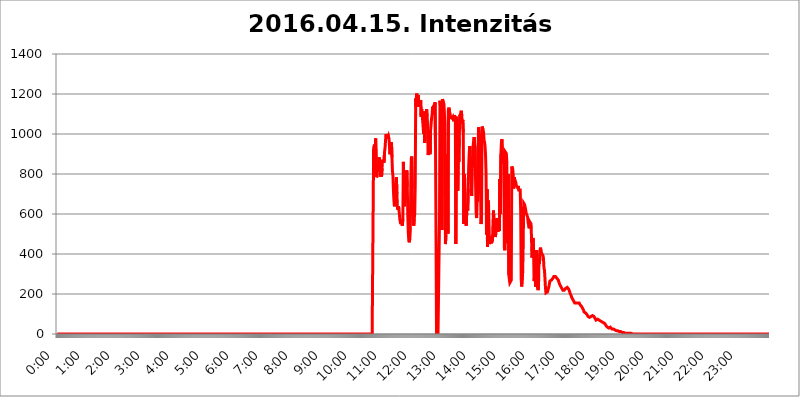
| Category | 2016.04.15. Intenzitás [W/m^2] |
|---|---|
| 0.0 | 0 |
| 0.0006944444444444445 | 0 |
| 0.001388888888888889 | 0 |
| 0.0020833333333333333 | 0 |
| 0.002777777777777778 | 0 |
| 0.003472222222222222 | 0 |
| 0.004166666666666667 | 0 |
| 0.004861111111111111 | 0 |
| 0.005555555555555556 | 0 |
| 0.0062499999999999995 | 0 |
| 0.006944444444444444 | 0 |
| 0.007638888888888889 | 0 |
| 0.008333333333333333 | 0 |
| 0.009027777777777779 | 0 |
| 0.009722222222222222 | 0 |
| 0.010416666666666666 | 0 |
| 0.011111111111111112 | 0 |
| 0.011805555555555555 | 0 |
| 0.012499999999999999 | 0 |
| 0.013194444444444444 | 0 |
| 0.013888888888888888 | 0 |
| 0.014583333333333332 | 0 |
| 0.015277777777777777 | 0 |
| 0.015972222222222224 | 0 |
| 0.016666666666666666 | 0 |
| 0.017361111111111112 | 0 |
| 0.018055555555555557 | 0 |
| 0.01875 | 0 |
| 0.019444444444444445 | 0 |
| 0.02013888888888889 | 0 |
| 0.020833333333333332 | 0 |
| 0.02152777777777778 | 0 |
| 0.022222222222222223 | 0 |
| 0.02291666666666667 | 0 |
| 0.02361111111111111 | 0 |
| 0.024305555555555556 | 0 |
| 0.024999999999999998 | 0 |
| 0.025694444444444447 | 0 |
| 0.02638888888888889 | 0 |
| 0.027083333333333334 | 0 |
| 0.027777777777777776 | 0 |
| 0.02847222222222222 | 0 |
| 0.029166666666666664 | 0 |
| 0.029861111111111113 | 0 |
| 0.030555555555555555 | 0 |
| 0.03125 | 0 |
| 0.03194444444444445 | 0 |
| 0.03263888888888889 | 0 |
| 0.03333333333333333 | 0 |
| 0.034027777777777775 | 0 |
| 0.034722222222222224 | 0 |
| 0.035416666666666666 | 0 |
| 0.036111111111111115 | 0 |
| 0.03680555555555556 | 0 |
| 0.0375 | 0 |
| 0.03819444444444444 | 0 |
| 0.03888888888888889 | 0 |
| 0.03958333333333333 | 0 |
| 0.04027777777777778 | 0 |
| 0.04097222222222222 | 0 |
| 0.041666666666666664 | 0 |
| 0.042361111111111106 | 0 |
| 0.04305555555555556 | 0 |
| 0.043750000000000004 | 0 |
| 0.044444444444444446 | 0 |
| 0.04513888888888889 | 0 |
| 0.04583333333333334 | 0 |
| 0.04652777777777778 | 0 |
| 0.04722222222222222 | 0 |
| 0.04791666666666666 | 0 |
| 0.04861111111111111 | 0 |
| 0.049305555555555554 | 0 |
| 0.049999999999999996 | 0 |
| 0.05069444444444445 | 0 |
| 0.051388888888888894 | 0 |
| 0.052083333333333336 | 0 |
| 0.05277777777777778 | 0 |
| 0.05347222222222222 | 0 |
| 0.05416666666666667 | 0 |
| 0.05486111111111111 | 0 |
| 0.05555555555555555 | 0 |
| 0.05625 | 0 |
| 0.05694444444444444 | 0 |
| 0.057638888888888885 | 0 |
| 0.05833333333333333 | 0 |
| 0.05902777777777778 | 0 |
| 0.059722222222222225 | 0 |
| 0.06041666666666667 | 0 |
| 0.061111111111111116 | 0 |
| 0.06180555555555556 | 0 |
| 0.0625 | 0 |
| 0.06319444444444444 | 0 |
| 0.06388888888888888 | 0 |
| 0.06458333333333334 | 0 |
| 0.06527777777777778 | 0 |
| 0.06597222222222222 | 0 |
| 0.06666666666666667 | 0 |
| 0.06736111111111111 | 0 |
| 0.06805555555555555 | 0 |
| 0.06874999999999999 | 0 |
| 0.06944444444444443 | 0 |
| 0.07013888888888889 | 0 |
| 0.07083333333333333 | 0 |
| 0.07152777777777779 | 0 |
| 0.07222222222222223 | 0 |
| 0.07291666666666667 | 0 |
| 0.07361111111111111 | 0 |
| 0.07430555555555556 | 0 |
| 0.075 | 0 |
| 0.07569444444444444 | 0 |
| 0.0763888888888889 | 0 |
| 0.07708333333333334 | 0 |
| 0.07777777777777778 | 0 |
| 0.07847222222222222 | 0 |
| 0.07916666666666666 | 0 |
| 0.0798611111111111 | 0 |
| 0.08055555555555556 | 0 |
| 0.08125 | 0 |
| 0.08194444444444444 | 0 |
| 0.08263888888888889 | 0 |
| 0.08333333333333333 | 0 |
| 0.08402777777777777 | 0 |
| 0.08472222222222221 | 0 |
| 0.08541666666666665 | 0 |
| 0.08611111111111112 | 0 |
| 0.08680555555555557 | 0 |
| 0.08750000000000001 | 0 |
| 0.08819444444444445 | 0 |
| 0.08888888888888889 | 0 |
| 0.08958333333333333 | 0 |
| 0.09027777777777778 | 0 |
| 0.09097222222222222 | 0 |
| 0.09166666666666667 | 0 |
| 0.09236111111111112 | 0 |
| 0.09305555555555556 | 0 |
| 0.09375 | 0 |
| 0.09444444444444444 | 0 |
| 0.09513888888888888 | 0 |
| 0.09583333333333333 | 0 |
| 0.09652777777777777 | 0 |
| 0.09722222222222222 | 0 |
| 0.09791666666666667 | 0 |
| 0.09861111111111111 | 0 |
| 0.09930555555555555 | 0 |
| 0.09999999999999999 | 0 |
| 0.10069444444444443 | 0 |
| 0.1013888888888889 | 0 |
| 0.10208333333333335 | 0 |
| 0.10277777777777779 | 0 |
| 0.10347222222222223 | 0 |
| 0.10416666666666667 | 0 |
| 0.10486111111111111 | 0 |
| 0.10555555555555556 | 0 |
| 0.10625 | 0 |
| 0.10694444444444444 | 0 |
| 0.1076388888888889 | 0 |
| 0.10833333333333334 | 0 |
| 0.10902777777777778 | 0 |
| 0.10972222222222222 | 0 |
| 0.1111111111111111 | 0 |
| 0.11180555555555556 | 0 |
| 0.11180555555555556 | 0 |
| 0.1125 | 0 |
| 0.11319444444444444 | 0 |
| 0.11388888888888889 | 0 |
| 0.11458333333333333 | 0 |
| 0.11527777777777777 | 0 |
| 0.11597222222222221 | 0 |
| 0.11666666666666665 | 0 |
| 0.1173611111111111 | 0 |
| 0.11805555555555557 | 0 |
| 0.11944444444444445 | 0 |
| 0.12013888888888889 | 0 |
| 0.12083333333333333 | 0 |
| 0.12152777777777778 | 0 |
| 0.12222222222222223 | 0 |
| 0.12291666666666667 | 0 |
| 0.12291666666666667 | 0 |
| 0.12361111111111112 | 0 |
| 0.12430555555555556 | 0 |
| 0.125 | 0 |
| 0.12569444444444444 | 0 |
| 0.12638888888888888 | 0 |
| 0.12708333333333333 | 0 |
| 0.16875 | 0 |
| 0.12847222222222224 | 0 |
| 0.12916666666666668 | 0 |
| 0.12986111111111112 | 0 |
| 0.13055555555555556 | 0 |
| 0.13125 | 0 |
| 0.13194444444444445 | 0 |
| 0.1326388888888889 | 0 |
| 0.13333333333333333 | 0 |
| 0.13402777777777777 | 0 |
| 0.13402777777777777 | 0 |
| 0.13472222222222222 | 0 |
| 0.13541666666666666 | 0 |
| 0.1361111111111111 | 0 |
| 0.13749999999999998 | 0 |
| 0.13819444444444443 | 0 |
| 0.1388888888888889 | 0 |
| 0.13958333333333334 | 0 |
| 0.14027777777777778 | 0 |
| 0.14097222222222222 | 0 |
| 0.14166666666666666 | 0 |
| 0.1423611111111111 | 0 |
| 0.14305555555555557 | 0 |
| 0.14375000000000002 | 0 |
| 0.14444444444444446 | 0 |
| 0.1451388888888889 | 0 |
| 0.1451388888888889 | 0 |
| 0.14652777777777778 | 0 |
| 0.14722222222222223 | 0 |
| 0.14791666666666667 | 0 |
| 0.1486111111111111 | 0 |
| 0.14930555555555555 | 0 |
| 0.15 | 0 |
| 0.15069444444444444 | 0 |
| 0.15138888888888888 | 0 |
| 0.15208333333333332 | 0 |
| 0.15277777777777776 | 0 |
| 0.15347222222222223 | 0 |
| 0.15416666666666667 | 0 |
| 0.15486111111111112 | 0 |
| 0.15555555555555556 | 0 |
| 0.15625 | 0 |
| 0.15694444444444444 | 0 |
| 0.15763888888888888 | 0 |
| 0.15833333333333333 | 0 |
| 0.15902777777777777 | 0 |
| 0.15972222222222224 | 0 |
| 0.16041666666666668 | 0 |
| 0.16111111111111112 | 0 |
| 0.16180555555555556 | 0 |
| 0.1625 | 0 |
| 0.16319444444444445 | 0 |
| 0.1638888888888889 | 0 |
| 0.16458333333333333 | 0 |
| 0.16527777777777777 | 0 |
| 0.16597222222222222 | 0 |
| 0.16666666666666666 | 0 |
| 0.1673611111111111 | 0 |
| 0.16805555555555554 | 0 |
| 0.16874999999999998 | 0 |
| 0.16944444444444443 | 0 |
| 0.17013888888888887 | 0 |
| 0.1708333333333333 | 0 |
| 0.17152777777777775 | 0 |
| 0.17222222222222225 | 0 |
| 0.1729166666666667 | 0 |
| 0.17361111111111113 | 0 |
| 0.17430555555555557 | 0 |
| 0.17500000000000002 | 0 |
| 0.17569444444444446 | 0 |
| 0.1763888888888889 | 0 |
| 0.17708333333333334 | 0 |
| 0.17777777777777778 | 0 |
| 0.17847222222222223 | 0 |
| 0.17916666666666667 | 0 |
| 0.1798611111111111 | 0 |
| 0.18055555555555555 | 0 |
| 0.18125 | 0 |
| 0.18194444444444444 | 0 |
| 0.1826388888888889 | 0 |
| 0.18333333333333335 | 0 |
| 0.1840277777777778 | 0 |
| 0.18472222222222223 | 0 |
| 0.18541666666666667 | 0 |
| 0.18611111111111112 | 0 |
| 0.18680555555555556 | 0 |
| 0.1875 | 0 |
| 0.18819444444444444 | 0 |
| 0.18888888888888888 | 0 |
| 0.18958333333333333 | 0 |
| 0.19027777777777777 | 0 |
| 0.1909722222222222 | 0 |
| 0.19166666666666665 | 0 |
| 0.19236111111111112 | 0 |
| 0.19305555555555554 | 0 |
| 0.19375 | 0 |
| 0.19444444444444445 | 0 |
| 0.1951388888888889 | 0 |
| 0.19583333333333333 | 0 |
| 0.19652777777777777 | 0 |
| 0.19722222222222222 | 0 |
| 0.19791666666666666 | 0 |
| 0.1986111111111111 | 0 |
| 0.19930555555555554 | 0 |
| 0.19999999999999998 | 0 |
| 0.20069444444444443 | 0 |
| 0.20138888888888887 | 0 |
| 0.2020833333333333 | 0 |
| 0.2027777777777778 | 0 |
| 0.2034722222222222 | 0 |
| 0.2041666666666667 | 0 |
| 0.20486111111111113 | 0 |
| 0.20555555555555557 | 0 |
| 0.20625000000000002 | 0 |
| 0.20694444444444446 | 0 |
| 0.2076388888888889 | 0 |
| 0.20833333333333334 | 0 |
| 0.20902777777777778 | 0 |
| 0.20972222222222223 | 0 |
| 0.21041666666666667 | 0 |
| 0.2111111111111111 | 0 |
| 0.21180555555555555 | 0 |
| 0.2125 | 0 |
| 0.21319444444444444 | 0 |
| 0.2138888888888889 | 0 |
| 0.21458333333333335 | 0 |
| 0.2152777777777778 | 0 |
| 0.21597222222222223 | 0 |
| 0.21666666666666667 | 0 |
| 0.21736111111111112 | 0 |
| 0.21805555555555556 | 0 |
| 0.21875 | 0 |
| 0.21944444444444444 | 0 |
| 0.22013888888888888 | 0 |
| 0.22083333333333333 | 0 |
| 0.22152777777777777 | 0 |
| 0.2222222222222222 | 0 |
| 0.22291666666666665 | 0 |
| 0.2236111111111111 | 0 |
| 0.22430555555555556 | 0 |
| 0.225 | 0 |
| 0.22569444444444445 | 0 |
| 0.2263888888888889 | 0 |
| 0.22708333333333333 | 0 |
| 0.22777777777777777 | 0 |
| 0.22847222222222222 | 0 |
| 0.22916666666666666 | 0 |
| 0.2298611111111111 | 0 |
| 0.23055555555555554 | 0 |
| 0.23124999999999998 | 0 |
| 0.23194444444444443 | 0 |
| 0.23263888888888887 | 0 |
| 0.2333333333333333 | 0 |
| 0.2340277777777778 | 0 |
| 0.2347222222222222 | 0 |
| 0.2354166666666667 | 0 |
| 0.23611111111111113 | 0 |
| 0.23680555555555557 | 0 |
| 0.23750000000000002 | 0 |
| 0.23819444444444446 | 0 |
| 0.2388888888888889 | 0 |
| 0.23958333333333334 | 0 |
| 0.24027777777777778 | 0 |
| 0.24097222222222223 | 0 |
| 0.24166666666666667 | 0 |
| 0.2423611111111111 | 0 |
| 0.24305555555555555 | 0 |
| 0.24375 | 0 |
| 0.24444444444444446 | 0 |
| 0.24513888888888888 | 0 |
| 0.24583333333333335 | 0 |
| 0.2465277777777778 | 0 |
| 0.24722222222222223 | 0 |
| 0.24791666666666667 | 0 |
| 0.24861111111111112 | 0 |
| 0.24930555555555556 | 0 |
| 0.25 | 0 |
| 0.25069444444444444 | 0 |
| 0.2513888888888889 | 0 |
| 0.2520833333333333 | 0 |
| 0.25277777777777777 | 0 |
| 0.2534722222222222 | 0 |
| 0.25416666666666665 | 0 |
| 0.2548611111111111 | 0 |
| 0.2555555555555556 | 0 |
| 0.25625000000000003 | 0 |
| 0.2569444444444445 | 0 |
| 0.2576388888888889 | 0 |
| 0.25833333333333336 | 0 |
| 0.2590277777777778 | 0 |
| 0.25972222222222224 | 0 |
| 0.2604166666666667 | 0 |
| 0.2611111111111111 | 0 |
| 0.26180555555555557 | 0 |
| 0.2625 | 0 |
| 0.26319444444444445 | 0 |
| 0.2638888888888889 | 0 |
| 0.26458333333333334 | 0 |
| 0.2652777777777778 | 0 |
| 0.2659722222222222 | 0 |
| 0.26666666666666666 | 0 |
| 0.2673611111111111 | 0 |
| 0.26805555555555555 | 0 |
| 0.26875 | 0 |
| 0.26944444444444443 | 0 |
| 0.2701388888888889 | 0 |
| 0.2708333333333333 | 0 |
| 0.27152777777777776 | 0 |
| 0.2722222222222222 | 0 |
| 0.27291666666666664 | 0 |
| 0.2736111111111111 | 0 |
| 0.2743055555555555 | 0 |
| 0.27499999999999997 | 0 |
| 0.27569444444444446 | 0 |
| 0.27638888888888885 | 0 |
| 0.27708333333333335 | 0 |
| 0.2777777777777778 | 0 |
| 0.27847222222222223 | 0 |
| 0.2791666666666667 | 0 |
| 0.2798611111111111 | 0 |
| 0.28055555555555556 | 0 |
| 0.28125 | 0 |
| 0.28194444444444444 | 0 |
| 0.2826388888888889 | 0 |
| 0.2833333333333333 | 0 |
| 0.28402777777777777 | 0 |
| 0.2847222222222222 | 0 |
| 0.28541666666666665 | 0 |
| 0.28611111111111115 | 0 |
| 0.28680555555555554 | 0 |
| 0.28750000000000003 | 0 |
| 0.2881944444444445 | 0 |
| 0.2888888888888889 | 0 |
| 0.28958333333333336 | 0 |
| 0.2902777777777778 | 0 |
| 0.29097222222222224 | 0 |
| 0.2916666666666667 | 0 |
| 0.2923611111111111 | 0 |
| 0.29305555555555557 | 0 |
| 0.29375 | 0 |
| 0.29444444444444445 | 0 |
| 0.2951388888888889 | 0 |
| 0.29583333333333334 | 0 |
| 0.2965277777777778 | 0 |
| 0.2972222222222222 | 0 |
| 0.29791666666666666 | 0 |
| 0.2986111111111111 | 0 |
| 0.29930555555555555 | 0 |
| 0.3 | 0 |
| 0.30069444444444443 | 0 |
| 0.3013888888888889 | 0 |
| 0.3020833333333333 | 0 |
| 0.30277777777777776 | 0 |
| 0.3034722222222222 | 0 |
| 0.30416666666666664 | 0 |
| 0.3048611111111111 | 0 |
| 0.3055555555555555 | 0 |
| 0.30624999999999997 | 0 |
| 0.3069444444444444 | 0 |
| 0.3076388888888889 | 0 |
| 0.30833333333333335 | 0 |
| 0.3090277777777778 | 0 |
| 0.30972222222222223 | 0 |
| 0.3104166666666667 | 0 |
| 0.3111111111111111 | 0 |
| 0.31180555555555556 | 0 |
| 0.3125 | 0 |
| 0.31319444444444444 | 0 |
| 0.3138888888888889 | 0 |
| 0.3145833333333333 | 0 |
| 0.31527777777777777 | 0 |
| 0.3159722222222222 | 0 |
| 0.31666666666666665 | 0 |
| 0.31736111111111115 | 0 |
| 0.31805555555555554 | 0 |
| 0.31875000000000003 | 0 |
| 0.3194444444444445 | 0 |
| 0.3201388888888889 | 0 |
| 0.32083333333333336 | 0 |
| 0.3215277777777778 | 0 |
| 0.32222222222222224 | 0 |
| 0.3229166666666667 | 0 |
| 0.3236111111111111 | 0 |
| 0.32430555555555557 | 0 |
| 0.325 | 0 |
| 0.32569444444444445 | 0 |
| 0.3263888888888889 | 0 |
| 0.32708333333333334 | 0 |
| 0.3277777777777778 | 0 |
| 0.3284722222222222 | 0 |
| 0.32916666666666666 | 0 |
| 0.3298611111111111 | 0 |
| 0.33055555555555555 | 0 |
| 0.33125 | 0 |
| 0.33194444444444443 | 0 |
| 0.3326388888888889 | 0 |
| 0.3333333333333333 | 0 |
| 0.3340277777777778 | 0 |
| 0.3347222222222222 | 0 |
| 0.3354166666666667 | 0 |
| 0.3361111111111111 | 0 |
| 0.3368055555555556 | 0 |
| 0.33749999999999997 | 0 |
| 0.33819444444444446 | 0 |
| 0.33888888888888885 | 0 |
| 0.33958333333333335 | 0 |
| 0.34027777777777773 | 0 |
| 0.34097222222222223 | 0 |
| 0.3416666666666666 | 0 |
| 0.3423611111111111 | 0 |
| 0.3430555555555555 | 0 |
| 0.34375 | 0 |
| 0.3444444444444445 | 0 |
| 0.3451388888888889 | 0 |
| 0.3458333333333334 | 0 |
| 0.34652777777777777 | 0 |
| 0.34722222222222227 | 0 |
| 0.34791666666666665 | 0 |
| 0.34861111111111115 | 0 |
| 0.34930555555555554 | 0 |
| 0.35000000000000003 | 0 |
| 0.3506944444444444 | 0 |
| 0.3513888888888889 | 0 |
| 0.3520833333333333 | 0 |
| 0.3527777777777778 | 0 |
| 0.3534722222222222 | 0 |
| 0.3541666666666667 | 0 |
| 0.3548611111111111 | 0 |
| 0.35555555555555557 | 0 |
| 0.35625 | 0 |
| 0.35694444444444445 | 0 |
| 0.3576388888888889 | 0 |
| 0.35833333333333334 | 0 |
| 0.3590277777777778 | 0 |
| 0.3597222222222222 | 0 |
| 0.36041666666666666 | 0 |
| 0.3611111111111111 | 0 |
| 0.36180555555555555 | 0 |
| 0.3625 | 0 |
| 0.36319444444444443 | 0 |
| 0.3638888888888889 | 0 |
| 0.3645833333333333 | 0 |
| 0.3652777777777778 | 0 |
| 0.3659722222222222 | 0 |
| 0.3666666666666667 | 0 |
| 0.3673611111111111 | 0 |
| 0.3680555555555556 | 0 |
| 0.36874999999999997 | 0 |
| 0.36944444444444446 | 0 |
| 0.37013888888888885 | 0 |
| 0.37083333333333335 | 0 |
| 0.37152777777777773 | 0 |
| 0.37222222222222223 | 0 |
| 0.3729166666666666 | 0 |
| 0.3736111111111111 | 0 |
| 0.3743055555555555 | 0 |
| 0.375 | 0 |
| 0.3756944444444445 | 0 |
| 0.3763888888888889 | 0 |
| 0.3770833333333334 | 0 |
| 0.37777777777777777 | 0 |
| 0.37847222222222227 | 0 |
| 0.37916666666666665 | 0 |
| 0.37986111111111115 | 0 |
| 0.38055555555555554 | 0 |
| 0.38125000000000003 | 0 |
| 0.3819444444444444 | 0 |
| 0.3826388888888889 | 0 |
| 0.3833333333333333 | 0 |
| 0.3840277777777778 | 0 |
| 0.3847222222222222 | 0 |
| 0.3854166666666667 | 0 |
| 0.3861111111111111 | 0 |
| 0.38680555555555557 | 0 |
| 0.3875 | 0 |
| 0.38819444444444445 | 0 |
| 0.3888888888888889 | 0 |
| 0.38958333333333334 | 0 |
| 0.3902777777777778 | 0 |
| 0.3909722222222222 | 0 |
| 0.39166666666666666 | 0 |
| 0.3923611111111111 | 0 |
| 0.39305555555555555 | 0 |
| 0.39375 | 0 |
| 0.39444444444444443 | 0 |
| 0.3951388888888889 | 0 |
| 0.3958333333333333 | 0 |
| 0.3965277777777778 | 0 |
| 0.3972222222222222 | 0 |
| 0.3979166666666667 | 0 |
| 0.3986111111111111 | 0 |
| 0.3993055555555556 | 0 |
| 0.39999999999999997 | 0 |
| 0.40069444444444446 | 0 |
| 0.40138888888888885 | 0 |
| 0.40208333333333335 | 0 |
| 0.40277777777777773 | 0 |
| 0.40347222222222223 | 0 |
| 0.4041666666666666 | 0 |
| 0.4048611111111111 | 0 |
| 0.4055555555555555 | 0 |
| 0.40625 | 0 |
| 0.4069444444444445 | 0 |
| 0.4076388888888889 | 0 |
| 0.4083333333333334 | 0 |
| 0.40902777777777777 | 0 |
| 0.40972222222222227 | 0 |
| 0.41041666666666665 | 0 |
| 0.41111111111111115 | 0 |
| 0.41180555555555554 | 0 |
| 0.41250000000000003 | 0 |
| 0.4131944444444444 | 0 |
| 0.4138888888888889 | 0 |
| 0.4145833333333333 | 0 |
| 0.4152777777777778 | 0 |
| 0.4159722222222222 | 0 |
| 0.4166666666666667 | 0 |
| 0.4173611111111111 | 0 |
| 0.41805555555555557 | 0 |
| 0.41875 | 0 |
| 0.41944444444444445 | 0 |
| 0.4201388888888889 | 0 |
| 0.42083333333333334 | 0 |
| 0.4215277777777778 | 0 |
| 0.4222222222222222 | 0 |
| 0.42291666666666666 | 0 |
| 0.4236111111111111 | 0 |
| 0.42430555555555555 | 0 |
| 0.425 | 0 |
| 0.42569444444444443 | 0 |
| 0.4263888888888889 | 0 |
| 0.4270833333333333 | 0 |
| 0.4277777777777778 | 0 |
| 0.4284722222222222 | 0 |
| 0.4291666666666667 | 0 |
| 0.4298611111111111 | 0 |
| 0.4305555555555556 | 0 |
| 0.43124999999999997 | 0 |
| 0.43194444444444446 | 0 |
| 0.43263888888888885 | 0 |
| 0.43333333333333335 | 0 |
| 0.43402777777777773 | 0 |
| 0.43472222222222223 | 0 |
| 0.4354166666666666 | 0 |
| 0.4361111111111111 | 0 |
| 0.4368055555555555 | 0 |
| 0.4375 | 0 |
| 0.4381944444444445 | 0 |
| 0.4388888888888889 | 0 |
| 0.4395833333333334 | 0 |
| 0.44027777777777777 | 0 |
| 0.44097222222222227 | 0 |
| 0.44166666666666665 | 0 |
| 0.44236111111111115 | 0 |
| 0.44305555555555554 | 0 |
| 0.44375000000000003 | 932.576 |
| 0.4444444444444444 | 932.576 |
| 0.4451388888888889 | 947.58 |
| 0.4458333333333333 | 909.996 |
| 0.4465277777777778 | 977.508 |
| 0.4472222222222222 | 879.719 |
| 0.4479166666666667 | 783.342 |
| 0.4486111111111111 | 791.169 |
| 0.44930555555555557 | 826.123 |
| 0.45 | 841.526 |
| 0.45069444444444445 | 829.981 |
| 0.4513888888888889 | 883.516 |
| 0.45208333333333334 | 841.526 |
| 0.4527777777777778 | 856.855 |
| 0.4534722222222222 | 787.258 |
| 0.45416666666666666 | 806.757 |
| 0.4548611111111111 | 787.258 |
| 0.45555555555555555 | 829.981 |
| 0.45625 | 872.114 |
| 0.45694444444444443 | 875.918 |
| 0.4576388888888889 | 868.305 |
| 0.4583333333333333 | 856.855 |
| 0.4590277777777778 | 909.996 |
| 0.4597222222222222 | 928.819 |
| 0.4604166666666667 | 966.295 |
| 0.4611111111111111 | 999.916 |
| 0.4618055555555556 | 996.182 |
| 0.46249999999999997 | 977.508 |
| 0.46319444444444446 | 999.916 |
| 0.46388888888888885 | 981.244 |
| 0.46458333333333335 | 988.714 |
| 0.46527777777777773 | 977.508 |
| 0.46597222222222223 | 981.244 |
| 0.4666666666666666 | 898.668 |
| 0.4673611111111111 | 936.33 |
| 0.4680555555555555 | 951.327 |
| 0.46875 | 958.814 |
| 0.4694444444444445 | 883.516 |
| 0.4701388888888889 | 814.519 |
| 0.4708333333333334 | 791.169 |
| 0.47152777777777777 | 715.858 |
| 0.47222222222222227 | 667.123 |
| 0.47291666666666665 | 638.256 |
| 0.47361111111111115 | 675.311 |
| 0.47430555555555554 | 743.859 |
| 0.47500000000000003 | 759.723 |
| 0.4756944444444444 | 783.342 |
| 0.4763888888888889 | 703.762 |
| 0.4770833333333333 | 634.105 |
| 0.4777777777777778 | 621.613 |
| 0.4784722222222222 | 638.256 |
| 0.4791666666666667 | 625.784 |
| 0.4798611111111111 | 621.613 |
| 0.48055555555555557 | 571.049 |
| 0.48125 | 558.261 |
| 0.48194444444444445 | 549.704 |
| 0.4826388888888889 | 575.299 |
| 0.48333333333333334 | 549.704 |
| 0.4840277777777778 | 541.121 |
| 0.4847222222222222 | 575.299 |
| 0.48541666666666666 | 860.676 |
| 0.4861111111111111 | 783.342 |
| 0.48680555555555555 | 638.256 |
| 0.4875 | 679.395 |
| 0.48819444444444443 | 798.974 |
| 0.4888888888888889 | 711.832 |
| 0.4895833333333333 | 779.42 |
| 0.4902777777777778 | 818.392 |
| 0.4909722222222222 | 735.89 |
| 0.4916666666666667 | 588.009 |
| 0.4923611111111111 | 506.542 |
| 0.4930555555555556 | 467.187 |
| 0.49374999999999997 | 458.38 |
| 0.49444444444444446 | 475.972 |
| 0.49513888888888885 | 515.223 |
| 0.49583333333333335 | 743.859 |
| 0.49652777777777773 | 875.918 |
| 0.49722222222222223 | 887.309 |
| 0.4979166666666666 | 727.896 |
| 0.4986111111111111 | 609.062 |
| 0.4993055555555555 | 583.779 |
| 0.5 | 541.121 |
| 0.5006944444444444 | 575.299 |
| 0.5013888888888889 | 600.661 |
| 0.5020833333333333 | 747.834 |
| 0.5027777777777778 | 1178.177 |
| 0.5034722222222222 | 1135.543 |
| 0.5041666666666667 | 1201.843 |
| 0.5048611111111111 | 1178.177 |
| 0.5055555555555555 | 1154.814 |
| 0.50625 | 1193.918 |
| 0.5069444444444444 | 1154.814 |
| 0.5076388888888889 | 1135.543 |
| 0.5083333333333333 | 1158.689 |
| 0.5090277777777777 | 1162.571 |
| 0.5097222222222222 | 1170.358 |
| 0.5104166666666666 | 1086.097 |
| 0.5111111111111112 | 1124.056 |
| 0.5118055555555555 | 1097.437 |
| 0.5125000000000001 | 1067.267 |
| 0.5131944444444444 | 1063.51 |
| 0.513888888888889 | 999.916 |
| 0.5145833333333333 | 1112.618 |
| 0.5152777777777778 | 955.071 |
| 0.5159722222222222 | 977.508 |
| 0.5166666666666667 | 1086.097 |
| 0.517361111111111 | 1063.51 |
| 0.5180555555555556 | 1124.056 |
| 0.5187499999999999 | 1086.097 |
| 0.5194444444444445 | 1048.508 |
| 0.5201388888888888 | 894.885 |
| 0.5208333333333334 | 909.996 |
| 0.5215277777777778 | 992.448 |
| 0.5222222222222223 | 977.508 |
| 0.5229166666666667 | 898.668 |
| 0.5236111111111111 | 1018.587 |
| 0.5243055555555556 | 1022.323 |
| 0.525 | 1078.555 |
| 0.5256944444444445 | 1093.653 |
| 0.5263888888888889 | 1131.708 |
| 0.5270833333333333 | 1135.543 |
| 0.5277777777777778 | 1139.384 |
| 0.5284722222222222 | 1097.437 |
| 0.5291666666666667 | 1124.056 |
| 0.5298611111111111 | 1158.689 |
| 0.5305555555555556 | 925.06 |
| 0.53125 | 489.108 |
| 0.5319444444444444 | 0 |
| 0.5326388888888889 | 0 |
| 0.5333333333333333 | 0 |
| 0.5340277777777778 | 0 |
| 0.5347222222222222 | 0 |
| 0.5354166666666667 | 0 |
| 0.5361111111111111 | 566.793 |
| 0.5368055555555555 | 1166.46 |
| 0.5375 | 1135.543 |
| 0.5381944444444444 | 1158.689 |
| 0.5388888888888889 | 1147.086 |
| 0.5395833333333333 | 519.555 |
| 0.5402777777777777 | 1174.263 |
| 0.5409722222222222 | 1178.177 |
| 0.5416666666666666 | 1170.358 |
| 0.5423611111111112 | 1147.086 |
| 0.5430555555555555 | 1147.086 |
| 0.5437500000000001 | 1052.255 |
| 0.5444444444444444 | 449.551 |
| 0.545138888888889 | 493.475 |
| 0.5458333333333333 | 575.299 |
| 0.5465277777777778 | 814.519 |
| 0.5472222222222222 | 898.668 |
| 0.5479166666666667 | 502.192 |
| 0.548611111111111 | 1120.238 |
| 0.5493055555555556 | 1131.708 |
| 0.5499999999999999 | 1135.543 |
| 0.5506944444444445 | 1127.879 |
| 0.5513888888888888 | 1082.324 |
| 0.5520833333333334 | 1086.097 |
| 0.5527777777777778 | 1086.097 |
| 0.5534722222222223 | 1078.555 |
| 0.5541666666666667 | 1082.324 |
| 0.5548611111111111 | 1086.097 |
| 0.5555555555555556 | 1074.789 |
| 0.55625 | 1063.51 |
| 0.5569444444444445 | 1093.653 |
| 0.5576388888888889 | 1089.873 |
| 0.5583333333333333 | 1082.324 |
| 0.5590277777777778 | 449.551 |
| 0.5597222222222222 | 947.58 |
| 0.5604166666666667 | 1086.097 |
| 0.5611111111111111 | 1018.587 |
| 0.5618055555555556 | 715.858 |
| 0.5625 | 913.766 |
| 0.5631944444444444 | 860.676 |
| 0.5638888888888889 | 977.508 |
| 0.5645833333333333 | 1097.437 |
| 0.5652777777777778 | 1089.873 |
| 0.5659722222222222 | 1105.019 |
| 0.5666666666666667 | 1116.426 |
| 0.5673611111111111 | 1089.873 |
| 0.5680555555555555 | 1052.255 |
| 0.56875 | 1071.027 |
| 0.5694444444444444 | 1007.383 |
| 0.5701388888888889 | 549.704 |
| 0.5708333333333333 | 798.974 |
| 0.5715277777777777 | 771.559 |
| 0.5722222222222222 | 609.062 |
| 0.5729166666666666 | 575.299 |
| 0.5736111111111112 | 541.121 |
| 0.5743055555555555 | 604.864 |
| 0.5750000000000001 | 642.4 |
| 0.5756944444444444 | 617.436 |
| 0.576388888888889 | 727.896 |
| 0.5770833333333333 | 841.526 |
| 0.5777777777777778 | 902.447 |
| 0.5784722222222222 | 940.082 |
| 0.5791666666666667 | 875.918 |
| 0.579861111111111 | 853.029 |
| 0.5805555555555556 | 791.169 |
| 0.5812499999999999 | 691.608 |
| 0.5819444444444445 | 856.855 |
| 0.5826388888888888 | 833.834 |
| 0.5833333333333334 | 943.832 |
| 0.5840277777777778 | 947.58 |
| 0.5847222222222223 | 984.98 |
| 0.5854166666666667 | 947.58 |
| 0.5861111111111111 | 925.06 |
| 0.5868055555555556 | 739.877 |
| 0.5875 | 609.062 |
| 0.5881944444444445 | 579.542 |
| 0.5888888888888889 | 759.723 |
| 0.5895833333333333 | 663.019 |
| 0.5902777777777778 | 940.082 |
| 0.5909722222222222 | 1033.537 |
| 0.5916666666666667 | 1007.383 |
| 0.5923611111111111 | 996.182 |
| 0.5930555555555556 | 739.877 |
| 0.59375 | 699.717 |
| 0.5944444444444444 | 549.704 |
| 0.5951388888888889 | 604.864 |
| 0.5958333333333333 | 1037.277 |
| 0.5965277777777778 | 1041.019 |
| 0.5972222222222222 | 1022.323 |
| 0.5979166666666667 | 1007.383 |
| 0.5986111111111111 | 970.034 |
| 0.5993055555555555 | 958.814 |
| 0.6 | 940.082 |
| 0.6006944444444444 | 894.885 |
| 0.6013888888888889 | 806.757 |
| 0.6020833333333333 | 497.836 |
| 0.6027777777777777 | 723.889 |
| 0.6034722222222222 | 436.27 |
| 0.6041666666666666 | 667.123 |
| 0.6048611111111112 | 654.791 |
| 0.6055555555555555 | 536.82 |
| 0.6062500000000001 | 449.551 |
| 0.6069444444444444 | 480.356 |
| 0.607638888888889 | 453.968 |
| 0.6083333333333333 | 489.108 |
| 0.6090277777777778 | 453.968 |
| 0.6097222222222222 | 449.551 |
| 0.6104166666666667 | 471.582 |
| 0.611111111111111 | 553.986 |
| 0.6118055555555556 | 617.436 |
| 0.6124999999999999 | 566.793 |
| 0.6131944444444445 | 545.416 |
| 0.6138888888888888 | 497.836 |
| 0.6145833333333334 | 484.735 |
| 0.6152777777777778 | 480.356 |
| 0.6159722222222223 | 489.108 |
| 0.6166666666666667 | 579.542 |
| 0.6173611111111111 | 519.555 |
| 0.6180555555555556 | 510.885 |
| 0.61875 | 528.2 |
| 0.6194444444444445 | 571.049 |
| 0.6201388888888889 | 515.223 |
| 0.6208333333333333 | 775.492 |
| 0.6215277777777778 | 600.661 |
| 0.6222222222222222 | 898.668 |
| 0.6229166666666667 | 955.071 |
| 0.6236111111111111 | 973.772 |
| 0.6243055555555556 | 909.996 |
| 0.625 | 902.447 |
| 0.6256944444444444 | 860.676 |
| 0.6263888888888889 | 849.199 |
| 0.6270833333333333 | 431.833 |
| 0.6277777777777778 | 418.492 |
| 0.6284722222222222 | 909.996 |
| 0.6291666666666667 | 909.996 |
| 0.6298611111111111 | 902.447 |
| 0.6305555555555555 | 860.676 |
| 0.63125 | 453.968 |
| 0.6319444444444444 | 613.252 |
| 0.6326388888888889 | 798.974 |
| 0.6333333333333333 | 296.808 |
| 0.6340277777777777 | 274.047 |
| 0.6347222222222222 | 255.813 |
| 0.6354166666666666 | 251.251 |
| 0.6361111111111112 | 255.813 |
| 0.6368055555555555 | 269.49 |
| 0.6375000000000001 | 837.682 |
| 0.6381944444444444 | 833.834 |
| 0.638888888888889 | 822.26 |
| 0.6395833333333333 | 791.169 |
| 0.6402777777777778 | 727.896 |
| 0.6409722222222222 | 783.342 |
| 0.6416666666666667 | 771.559 |
| 0.642361111111111 | 775.492 |
| 0.6430555555555556 | 759.723 |
| 0.6437499999999999 | 743.859 |
| 0.6444444444444445 | 739.877 |
| 0.6451388888888888 | 735.89 |
| 0.6458333333333334 | 727.896 |
| 0.6465277777777778 | 739.877 |
| 0.6472222222222223 | 719.877 |
| 0.6479166666666667 | 719.877 |
| 0.6486111111111111 | 723.889 |
| 0.6493055555555556 | 719.877 |
| 0.65 | 613.252 |
| 0.6506944444444445 | 274.047 |
| 0.6513888888888889 | 237.564 |
| 0.6520833333333333 | 242.127 |
| 0.6527777777777778 | 310.44 |
| 0.6534722222222222 | 436.27 |
| 0.6541666666666667 | 654.791 |
| 0.6548611111111111 | 654.791 |
| 0.6555555555555556 | 646.537 |
| 0.65625 | 634.105 |
| 0.6569444444444444 | 621.613 |
| 0.6576388888888889 | 604.864 |
| 0.6583333333333333 | 600.661 |
| 0.6590277777777778 | 600.661 |
| 0.6597222222222222 | 583.779 |
| 0.6604166666666667 | 558.261 |
| 0.6611111111111111 | 558.261 |
| 0.6618055555555555 | 528.2 |
| 0.6625 | 536.82 |
| 0.6631944444444444 | 558.261 |
| 0.6638888888888889 | 558.261 |
| 0.6645833333333333 | 549.704 |
| 0.6652777777777777 | 462.786 |
| 0.6659722222222222 | 382.715 |
| 0.6666666666666666 | 471.582 |
| 0.6673611111111111 | 480.356 |
| 0.6680555555555556 | 427.39 |
| 0.6687500000000001 | 264.932 |
| 0.6694444444444444 | 264.932 |
| 0.6701388888888888 | 301.354 |
| 0.6708333333333334 | 237.564 |
| 0.6715277777777778 | 242.127 |
| 0.6722222222222222 | 418.492 |
| 0.6729166666666666 | 242.127 |
| 0.6736111111111112 | 233 |
| 0.6743055555555556 | 219.309 |
| 0.6749999999999999 | 233 |
| 0.6756944444444444 | 378.224 |
| 0.6763888888888889 | 351.198 |
| 0.6770833333333334 | 418.492 |
| 0.6777777777777777 | 431.833 |
| 0.6784722222222223 | 414.035 |
| 0.6791666666666667 | 414.035 |
| 0.6798611111111111 | 400.638 |
| 0.6805555555555555 | 405.108 |
| 0.68125 | 391.685 |
| 0.6819444444444445 | 378.224 |
| 0.6826388888888889 | 328.584 |
| 0.6833333333333332 | 319.517 |
| 0.6840277777777778 | 278.603 |
| 0.6847222222222222 | 233 |
| 0.6854166666666667 | 205.62 |
| 0.686111111111111 | 201.058 |
| 0.6868055555555556 | 201.058 |
| 0.6875 | 210.182 |
| 0.6881944444444444 | 214.746 |
| 0.688888888888889 | 228.436 |
| 0.6895833333333333 | 237.564 |
| 0.6902777777777778 | 242.127 |
| 0.6909722222222222 | 264.932 |
| 0.6916666666666668 | 260.373 |
| 0.6923611111111111 | 260.373 |
| 0.6930555555555555 | 269.49 |
| 0.69375 | 269.49 |
| 0.6944444444444445 | 274.047 |
| 0.6951388888888889 | 278.603 |
| 0.6958333333333333 | 283.156 |
| 0.6965277777777777 | 287.709 |
| 0.6972222222222223 | 287.709 |
| 0.6979166666666666 | 287.709 |
| 0.6986111111111111 | 287.709 |
| 0.6993055555555556 | 287.709 |
| 0.7000000000000001 | 283.156 |
| 0.7006944444444444 | 278.603 |
| 0.7013888888888888 | 278.603 |
| 0.7020833333333334 | 274.047 |
| 0.7027777777777778 | 269.49 |
| 0.7034722222222222 | 260.373 |
| 0.7041666666666666 | 255.813 |
| 0.7048611111111112 | 246.689 |
| 0.7055555555555556 | 242.127 |
| 0.7062499999999999 | 237.564 |
| 0.7069444444444444 | 233 |
| 0.7076388888888889 | 228.436 |
| 0.7083333333333334 | 223.873 |
| 0.7090277777777777 | 219.309 |
| 0.7097222222222223 | 214.746 |
| 0.7104166666666667 | 219.309 |
| 0.7111111111111111 | 219.309 |
| 0.7118055555555555 | 219.309 |
| 0.7125 | 219.309 |
| 0.7131944444444445 | 228.436 |
| 0.7138888888888889 | 228.436 |
| 0.7145833333333332 | 228.436 |
| 0.7152777777777778 | 233 |
| 0.7159722222222222 | 233 |
| 0.7166666666666667 | 228.436 |
| 0.717361111111111 | 223.873 |
| 0.7180555555555556 | 219.309 |
| 0.71875 | 210.182 |
| 0.7194444444444444 | 201.058 |
| 0.720138888888889 | 196.497 |
| 0.7208333333333333 | 191.937 |
| 0.7215277777777778 | 182.82 |
| 0.7222222222222222 | 178.264 |
| 0.7229166666666668 | 173.709 |
| 0.7236111111111111 | 169.156 |
| 0.7243055555555555 | 164.605 |
| 0.725 | 160.056 |
| 0.7256944444444445 | 155.509 |
| 0.7263888888888889 | 155.509 |
| 0.7270833333333333 | 155.509 |
| 0.7277777777777777 | 155.509 |
| 0.7284722222222223 | 155.509 |
| 0.7291666666666666 | 155.509 |
| 0.7298611111111111 | 155.509 |
| 0.7305555555555556 | 155.509 |
| 0.7312500000000001 | 155.509 |
| 0.7319444444444444 | 155.509 |
| 0.7326388888888888 | 150.964 |
| 0.7333333333333334 | 146.423 |
| 0.7340277777777778 | 146.423 |
| 0.7347222222222222 | 141.884 |
| 0.7354166666666666 | 137.347 |
| 0.7361111111111112 | 132.814 |
| 0.7368055555555556 | 128.284 |
| 0.7374999999999999 | 123.758 |
| 0.7381944444444444 | 119.235 |
| 0.7388888888888889 | 110.201 |
| 0.7395833333333334 | 110.201 |
| 0.7402777777777777 | 105.69 |
| 0.7409722222222223 | 105.69 |
| 0.7416666666666667 | 105.69 |
| 0.7423611111111111 | 101.184 |
| 0.7430555555555555 | 96.682 |
| 0.74375 | 92.184 |
| 0.7444444444444445 | 87.692 |
| 0.7451388888888889 | 87.692 |
| 0.7458333333333332 | 83.205 |
| 0.7465277777777778 | 83.205 |
| 0.7472222222222222 | 83.205 |
| 0.7479166666666667 | 83.205 |
| 0.748611111111111 | 87.692 |
| 0.7493055555555556 | 92.184 |
| 0.75 | 92.184 |
| 0.7506944444444444 | 92.184 |
| 0.751388888888889 | 92.184 |
| 0.7520833333333333 | 92.184 |
| 0.7527777777777778 | 87.692 |
| 0.7534722222222222 | 83.205 |
| 0.7541666666666668 | 78.722 |
| 0.7548611111111111 | 74.246 |
| 0.7555555555555555 | 69.775 |
| 0.75625 | 69.775 |
| 0.7569444444444445 | 69.775 |
| 0.7576388888888889 | 74.246 |
| 0.7583333333333333 | 74.246 |
| 0.7590277777777777 | 69.775 |
| 0.7597222222222223 | 69.775 |
| 0.7604166666666666 | 65.31 |
| 0.7611111111111111 | 65.31 |
| 0.7618055555555556 | 65.31 |
| 0.7625000000000001 | 65.31 |
| 0.7631944444444444 | 60.85 |
| 0.7638888888888888 | 60.85 |
| 0.7645833333333334 | 60.85 |
| 0.7652777777777778 | 56.398 |
| 0.7659722222222222 | 56.398 |
| 0.7666666666666666 | 56.398 |
| 0.7673611111111112 | 56.398 |
| 0.7680555555555556 | 51.951 |
| 0.7687499999999999 | 47.511 |
| 0.7694444444444444 | 43.079 |
| 0.7701388888888889 | 38.653 |
| 0.7708333333333334 | 38.653 |
| 0.7715277777777777 | 34.234 |
| 0.7722222222222223 | 34.234 |
| 0.7729166666666667 | 29.823 |
| 0.7736111111111111 | 29.823 |
| 0.7743055555555555 | 34.234 |
| 0.775 | 34.234 |
| 0.7756944444444445 | 34.234 |
| 0.7763888888888889 | 29.823 |
| 0.7770833333333332 | 29.823 |
| 0.7777777777777778 | 25.419 |
| 0.7784722222222222 | 25.419 |
| 0.7791666666666667 | 25.419 |
| 0.779861111111111 | 25.419 |
| 0.7805555555555556 | 21.024 |
| 0.78125 | 21.024 |
| 0.7819444444444444 | 21.024 |
| 0.782638888888889 | 21.024 |
| 0.7833333333333333 | 21.024 |
| 0.7840277777777778 | 16.636 |
| 0.7847222222222222 | 16.636 |
| 0.7854166666666668 | 16.636 |
| 0.7861111111111111 | 16.636 |
| 0.7868055555555555 | 12.257 |
| 0.7875 | 12.257 |
| 0.7881944444444445 | 12.257 |
| 0.7888888888888889 | 12.257 |
| 0.7895833333333333 | 12.257 |
| 0.7902777777777777 | 12.257 |
| 0.7909722222222223 | 12.257 |
| 0.7916666666666666 | 7.887 |
| 0.7923611111111111 | 7.887 |
| 0.7930555555555556 | 7.887 |
| 0.7937500000000001 | 7.887 |
| 0.7944444444444444 | 7.887 |
| 0.7951388888888888 | 3.525 |
| 0.7958333333333334 | 3.525 |
| 0.7965277777777778 | 3.525 |
| 0.7972222222222222 | 3.525 |
| 0.7979166666666666 | 3.525 |
| 0.7986111111111112 | 3.525 |
| 0.7993055555555556 | 3.525 |
| 0.7999999999999999 | 3.525 |
| 0.8006944444444444 | 3.525 |
| 0.8013888888888889 | 3.525 |
| 0.8020833333333334 | 3.525 |
| 0.8027777777777777 | 3.525 |
| 0.8034722222222223 | 3.525 |
| 0.8041666666666667 | 3.525 |
| 0.8048611111111111 | 3.525 |
| 0.8055555555555555 | 3.525 |
| 0.80625 | 0 |
| 0.8069444444444445 | 0 |
| 0.8076388888888889 | 0 |
| 0.8083333333333332 | 0 |
| 0.8090277777777778 | 0 |
| 0.8097222222222222 | 0 |
| 0.8104166666666667 | 0 |
| 0.811111111111111 | 0 |
| 0.8118055555555556 | 0 |
| 0.8125 | 0 |
| 0.8131944444444444 | 0 |
| 0.813888888888889 | 0 |
| 0.8145833333333333 | 0 |
| 0.8152777777777778 | 0 |
| 0.8159722222222222 | 0 |
| 0.8166666666666668 | 0 |
| 0.8173611111111111 | 0 |
| 0.8180555555555555 | 0 |
| 0.81875 | 0 |
| 0.8194444444444445 | 0 |
| 0.8201388888888889 | 0 |
| 0.8208333333333333 | 0 |
| 0.8215277777777777 | 0 |
| 0.8222222222222223 | 0 |
| 0.8229166666666666 | 0 |
| 0.8236111111111111 | 0 |
| 0.8243055555555556 | 0 |
| 0.8250000000000001 | 0 |
| 0.8256944444444444 | 0 |
| 0.8263888888888888 | 0 |
| 0.8270833333333334 | 0 |
| 0.8277777777777778 | 0 |
| 0.8284722222222222 | 0 |
| 0.8291666666666666 | 0 |
| 0.8298611111111112 | 0 |
| 0.8305555555555556 | 0 |
| 0.8312499999999999 | 0 |
| 0.8319444444444444 | 0 |
| 0.8326388888888889 | 0 |
| 0.8333333333333334 | 0 |
| 0.8340277777777777 | 0 |
| 0.8347222222222223 | 0 |
| 0.8354166666666667 | 0 |
| 0.8361111111111111 | 0 |
| 0.8368055555555555 | 0 |
| 0.8375 | 0 |
| 0.8381944444444445 | 0 |
| 0.8388888888888889 | 0 |
| 0.8395833333333332 | 0 |
| 0.8402777777777778 | 0 |
| 0.8409722222222222 | 0 |
| 0.8416666666666667 | 0 |
| 0.842361111111111 | 0 |
| 0.8430555555555556 | 0 |
| 0.84375 | 0 |
| 0.8444444444444444 | 0 |
| 0.845138888888889 | 0 |
| 0.8458333333333333 | 0 |
| 0.8465277777777778 | 0 |
| 0.8472222222222222 | 0 |
| 0.8479166666666668 | 0 |
| 0.8486111111111111 | 0 |
| 0.8493055555555555 | 0 |
| 0.85 | 0 |
| 0.8506944444444445 | 0 |
| 0.8513888888888889 | 0 |
| 0.8520833333333333 | 0 |
| 0.8527777777777777 | 0 |
| 0.8534722222222223 | 0 |
| 0.8541666666666666 | 0 |
| 0.8548611111111111 | 0 |
| 0.8555555555555556 | 0 |
| 0.8562500000000001 | 0 |
| 0.8569444444444444 | 0 |
| 0.8576388888888888 | 0 |
| 0.8583333333333334 | 0 |
| 0.8590277777777778 | 0 |
| 0.8597222222222222 | 0 |
| 0.8604166666666666 | 0 |
| 0.8611111111111112 | 0 |
| 0.8618055555555556 | 0 |
| 0.8624999999999999 | 0 |
| 0.8631944444444444 | 0 |
| 0.8638888888888889 | 0 |
| 0.8645833333333334 | 0 |
| 0.8652777777777777 | 0 |
| 0.8659722222222223 | 0 |
| 0.8666666666666667 | 0 |
| 0.8673611111111111 | 0 |
| 0.8680555555555555 | 0 |
| 0.86875 | 0 |
| 0.8694444444444445 | 0 |
| 0.8701388888888889 | 0 |
| 0.8708333333333332 | 0 |
| 0.8715277777777778 | 0 |
| 0.8722222222222222 | 0 |
| 0.8729166666666667 | 0 |
| 0.873611111111111 | 0 |
| 0.8743055555555556 | 0 |
| 0.875 | 0 |
| 0.8756944444444444 | 0 |
| 0.876388888888889 | 0 |
| 0.8770833333333333 | 0 |
| 0.8777777777777778 | 0 |
| 0.8784722222222222 | 0 |
| 0.8791666666666668 | 0 |
| 0.8798611111111111 | 0 |
| 0.8805555555555555 | 0 |
| 0.88125 | 0 |
| 0.8819444444444445 | 0 |
| 0.8826388888888889 | 0 |
| 0.8833333333333333 | 0 |
| 0.8840277777777777 | 0 |
| 0.8847222222222223 | 0 |
| 0.8854166666666666 | 0 |
| 0.8861111111111111 | 0 |
| 0.8868055555555556 | 0 |
| 0.8875000000000001 | 0 |
| 0.8881944444444444 | 0 |
| 0.8888888888888888 | 0 |
| 0.8895833333333334 | 0 |
| 0.8902777777777778 | 0 |
| 0.8909722222222222 | 0 |
| 0.8916666666666666 | 0 |
| 0.8923611111111112 | 0 |
| 0.8930555555555556 | 0 |
| 0.8937499999999999 | 0 |
| 0.8944444444444444 | 0 |
| 0.8951388888888889 | 0 |
| 0.8958333333333334 | 0 |
| 0.8965277777777777 | 0 |
| 0.8972222222222223 | 0 |
| 0.8979166666666667 | 0 |
| 0.8986111111111111 | 0 |
| 0.8993055555555555 | 0 |
| 0.9 | 0 |
| 0.9006944444444445 | 0 |
| 0.9013888888888889 | 0 |
| 0.9020833333333332 | 0 |
| 0.9027777777777778 | 0 |
| 0.9034722222222222 | 0 |
| 0.9041666666666667 | 0 |
| 0.904861111111111 | 0 |
| 0.9055555555555556 | 0 |
| 0.90625 | 0 |
| 0.9069444444444444 | 0 |
| 0.907638888888889 | 0 |
| 0.9083333333333333 | 0 |
| 0.9090277777777778 | 0 |
| 0.9097222222222222 | 0 |
| 0.9104166666666668 | 0 |
| 0.9111111111111111 | 0 |
| 0.9118055555555555 | 0 |
| 0.9125 | 0 |
| 0.9131944444444445 | 0 |
| 0.9138888888888889 | 0 |
| 0.9145833333333333 | 0 |
| 0.9152777777777777 | 0 |
| 0.9159722222222223 | 0 |
| 0.9166666666666666 | 0 |
| 0.9173611111111111 | 0 |
| 0.9180555555555556 | 0 |
| 0.9187500000000001 | 0 |
| 0.9194444444444444 | 0 |
| 0.9201388888888888 | 0 |
| 0.9208333333333334 | 0 |
| 0.9215277777777778 | 0 |
| 0.9222222222222222 | 0 |
| 0.9229166666666666 | 0 |
| 0.9236111111111112 | 0 |
| 0.9243055555555556 | 0 |
| 0.9249999999999999 | 0 |
| 0.9256944444444444 | 0 |
| 0.9263888888888889 | 0 |
| 0.9270833333333334 | 0 |
| 0.9277777777777777 | 0 |
| 0.9284722222222223 | 0 |
| 0.9291666666666667 | 0 |
| 0.9298611111111111 | 0 |
| 0.9305555555555555 | 0 |
| 0.93125 | 0 |
| 0.9319444444444445 | 0 |
| 0.9326388888888889 | 0 |
| 0.9333333333333332 | 0 |
| 0.9340277777777778 | 0 |
| 0.9347222222222222 | 0 |
| 0.9354166666666667 | 0 |
| 0.936111111111111 | 0 |
| 0.9368055555555556 | 0 |
| 0.9375 | 0 |
| 0.9381944444444444 | 0 |
| 0.938888888888889 | 0 |
| 0.9395833333333333 | 0 |
| 0.9402777777777778 | 0 |
| 0.9409722222222222 | 0 |
| 0.9416666666666668 | 0 |
| 0.9423611111111111 | 0 |
| 0.9430555555555555 | 0 |
| 0.94375 | 0 |
| 0.9444444444444445 | 0 |
| 0.9451388888888889 | 0 |
| 0.9458333333333333 | 0 |
| 0.9465277777777777 | 0 |
| 0.9472222222222223 | 0 |
| 0.9479166666666666 | 0 |
| 0.9486111111111111 | 0 |
| 0.9493055555555556 | 0 |
| 0.9500000000000001 | 0 |
| 0.9506944444444444 | 0 |
| 0.9513888888888888 | 0 |
| 0.9520833333333334 | 0 |
| 0.9527777777777778 | 0 |
| 0.9534722222222222 | 0 |
| 0.9541666666666666 | 0 |
| 0.9548611111111112 | 0 |
| 0.9555555555555556 | 0 |
| 0.9562499999999999 | 0 |
| 0.9569444444444444 | 0 |
| 0.9576388888888889 | 0 |
| 0.9583333333333334 | 0 |
| 0.9590277777777777 | 0 |
| 0.9597222222222223 | 0 |
| 0.9604166666666667 | 0 |
| 0.9611111111111111 | 0 |
| 0.9618055555555555 | 0 |
| 0.9625 | 0 |
| 0.9631944444444445 | 0 |
| 0.9638888888888889 | 0 |
| 0.9645833333333332 | 0 |
| 0.9652777777777778 | 0 |
| 0.9659722222222222 | 0 |
| 0.9666666666666667 | 0 |
| 0.967361111111111 | 0 |
| 0.9680555555555556 | 0 |
| 0.96875 | 0 |
| 0.9694444444444444 | 0 |
| 0.970138888888889 | 0 |
| 0.9708333333333333 | 0 |
| 0.9715277777777778 | 0 |
| 0.9722222222222222 | 0 |
| 0.9729166666666668 | 0 |
| 0.9736111111111111 | 0 |
| 0.9743055555555555 | 0 |
| 0.975 | 0 |
| 0.9756944444444445 | 0 |
| 0.9763888888888889 | 0 |
| 0.9770833333333333 | 0 |
| 0.9777777777777777 | 0 |
| 0.9784722222222223 | 0 |
| 0.9791666666666666 | 0 |
| 0.9798611111111111 | 0 |
| 0.9805555555555556 | 0 |
| 0.9812500000000001 | 0 |
| 0.9819444444444444 | 0 |
| 0.9826388888888888 | 0 |
| 0.9833333333333334 | 0 |
| 0.9840277777777778 | 0 |
| 0.9847222222222222 | 0 |
| 0.9854166666666666 | 0 |
| 0.9861111111111112 | 0 |
| 0.9868055555555556 | 0 |
| 0.9874999999999999 | 0 |
| 0.9881944444444444 | 0 |
| 0.9888888888888889 | 0 |
| 0.9895833333333334 | 0 |
| 0.9902777777777777 | 0 |
| 0.9909722222222223 | 0 |
| 0.9916666666666667 | 0 |
| 0.9923611111111111 | 0 |
| 0.9930555555555555 | 0 |
| 0.99375 | 0 |
| 0.9944444444444445 | 0 |
| 0.9951388888888889 | 0 |
| 0.9958333333333332 | 0 |
| 0.9965277777777778 | 0 |
| 0.9972222222222222 | 0 |
| 0.9979166666666667 | 0 |
| 0.998611111111111 | 0 |
| 0.9993055555555556 | 0 |